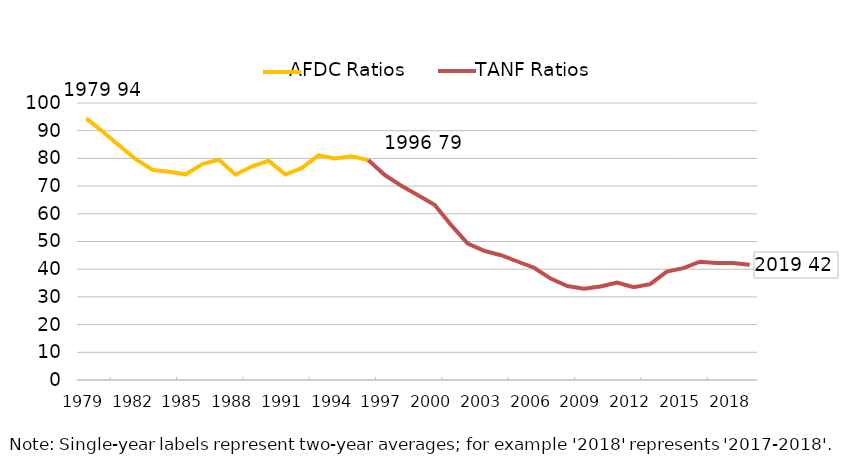
| Category | New York |
|---|---|
| 1979.0 | 94.435 |
| 1980.0 | 89.639 |
| 1981.0 | 84.567 |
| 1982.0 | 79.607 |
| 1983.0 | 75.85 |
| 1984.0 | 75.207 |
| 1985.0 | 74.257 |
| 1986.0 | 77.92 |
| 1987.0 | 79.487 |
| 1988.0 | 74.113 |
| 1989.0 | 77.168 |
| 1990.0 | 79.113 |
| 1991.0 | 74.161 |
| 1992.0 | 76.556 |
| 1993.0 | 81.102 |
| 1994.0 | 79.935 |
| 1995.0 | 80.725 |
| 1996.0 | 79.391 |
| 1997.0 | 73.994 |
| 1998.0 | 70.086 |
| 1999.0 | 66.699 |
| 2000.0 | 63.288 |
| 2001.0 | 55.928 |
| 2002.0 | 49.25 |
| 2003.0 | 46.629 |
| 2004.0 | 45.043 |
| 2005.0 | 42.781 |
| 2006.0 | 40.536 |
| 2007.0 | 36.603 |
| 2008.0 | 33.93 |
| 2009.0 | 32.987 |
| 2010.0 | 33.755 |
| 2011.0 | 35.18 |
| 2012.0 | 33.5 |
| 2013.0 | 34.619 |
| 2014.0 | 39.122 |
| 2015.0 | 40.381 |
| 2016.0 | 42.689 |
| 2017.0 | 42.218 |
| 2018.0 | 42.271 |
| 2019.0 | 41.599 |